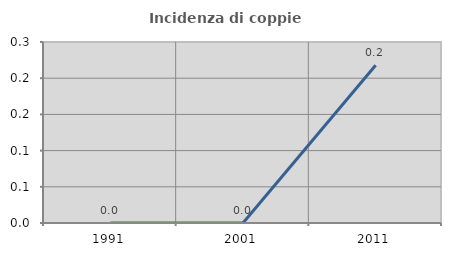
| Category | Incidenza di coppie miste |
|---|---|
| 1991.0 | 0 |
| 2001.0 | 0 |
| 2011.0 | 0.218 |